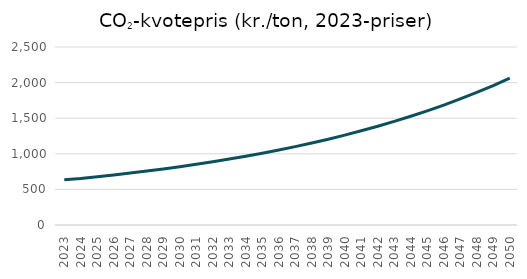
| Category | CO2-kvoter |
|---|---|
| 2023.0 | 636 |
| 2024.0 | 654 |
| 2025.0 | 678 |
| 2026.0 | 702 |
| 2027.0 | 729 |
| 2028.0 | 757 |
| 2029.0 | 787 |
| 2030.0 | 818 |
| 2031.0 | 852 |
| 2032.0 | 888 |
| 2033.0 | 926 |
| 2034.0 | 966 |
| 2035.0 | 1008 |
| 2036.0 | 1053 |
| 2037.0 | 1101 |
| 2038.0 | 1152 |
| 2039.0 | 1205 |
| 2040.0 | 1262 |
| 2041.0 | 1323 |
| 2042.0 | 1387 |
| 2043.0 | 1455 |
| 2044.0 | 1527 |
| 2045.0 | 1603 |
| 2046.0 | 1684 |
| 2047.0 | 1771 |
| 2048.0 | 1862 |
| 2049.0 | 1959 |
| 2050.0 | 2063 |